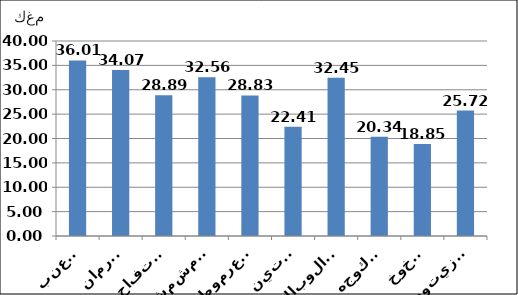
| Category | 2019 |
|---|---|
| العنب | 36.014 |
| الرمان | 34.068 |
| التفاح | 28.894 |
| المشمش | 32.565 |
| العرموط | 28.826 |
| التين | 22.41 |
| الالوبالو | 32.447 |
| الكوجه | 20.34 |
| الخوخ | 18.854 |
| الزيتون | 25.721 |